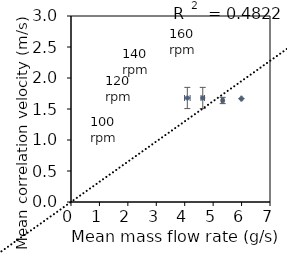
| Category | Series 0 |
|---|---|
| 4.091933333333333 | 1.678 |
| 4.634966666666666 | 1.678 |
| 5.334866666666667 | 1.637 |
| 5.994566666666667 | 1.667 |